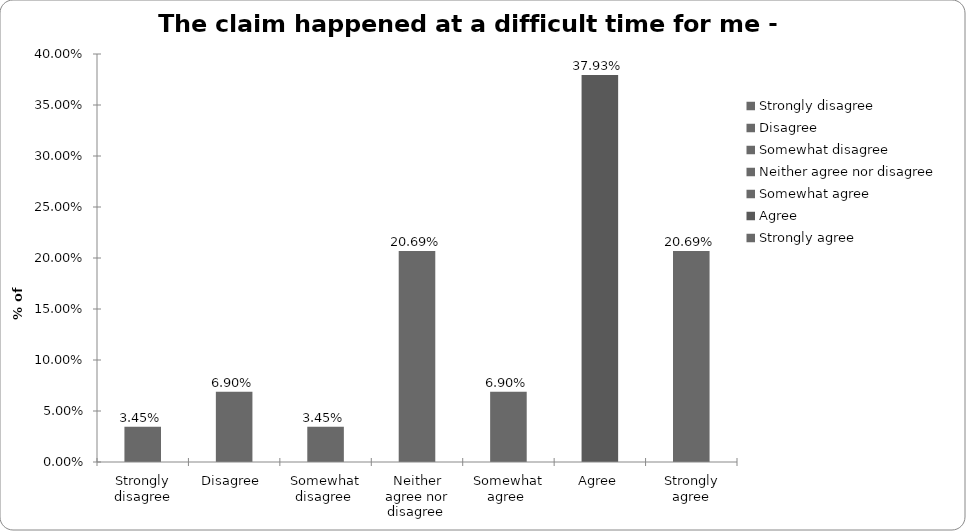
| Category | Series 0 |
|---|---|
| Strongly disagree | 0.034 |
| Disagree  | 0.069 |
| Somewhat disagree  | 0.034 |
| Neither agree nor disagree  | 0.207 |
| Somewhat agree  | 0.069 |
| Agree | 0.379 |
| Strongly agree | 0.207 |